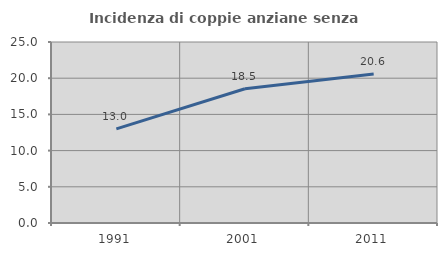
| Category | Incidenza di coppie anziane senza figli  |
|---|---|
| 1991.0 | 12.995 |
| 2001.0 | 18.536 |
| 2011.0 | 20.576 |